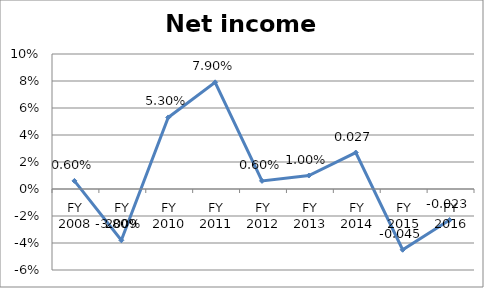
| Category | Net income ratio |
|---|---|
| FY 2016 | -0.023 |
| FY 2015 | -0.045 |
| FY 2014 | 0.027 |
| FY 2013 | 0.01 |
| FY 2012 | 0.006 |
| FY 2011 | 0.079 |
| FY 2010 | 0.053 |
| FY 2009 | -0.038 |
| FY 2008 | 0.006 |